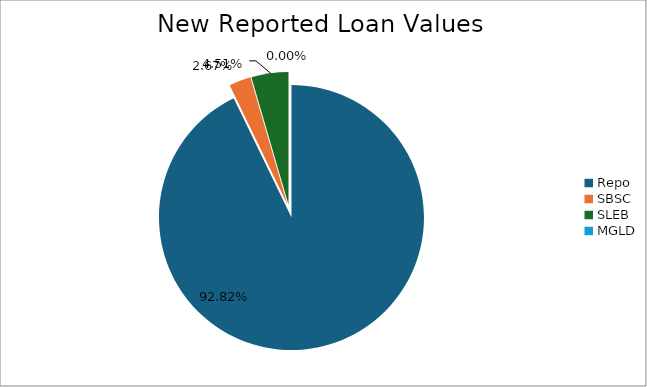
| Category | Series 0 |
|---|---|
| Repo | 9580652.247 |
| SBSC | 275205.204 |
| SLEB | 465809.211 |
| MGLD | 150.951 |